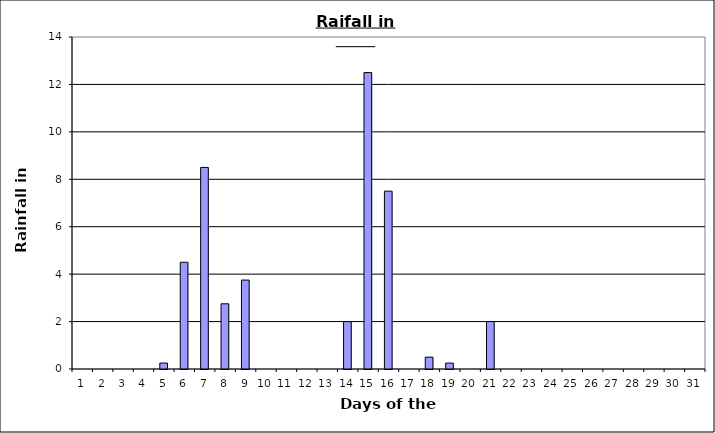
| Category | Series 0 |
|---|---|
| 0 | 0 |
| 1 | 0 |
| 2 | 0 |
| 3 | 0 |
| 4 | 0.25 |
| 5 | 4.5 |
| 6 | 8.5 |
| 7 | 2.75 |
| 8 | 3.75 |
| 9 | 0 |
| 10 | 0 |
| 11 | 0 |
| 12 | 0 |
| 13 | 2 |
| 14 | 12.5 |
| 15 | 7.5 |
| 16 | 0 |
| 17 | 0.5 |
| 18 | 0.25 |
| 19 | 0 |
| 20 | 2 |
| 21 | 0 |
| 22 | 0 |
| 23 | 0 |
| 24 | 0 |
| 25 | 0 |
| 26 | 0 |
| 27 | 0 |
| 28 | 0 |
| 29 | 0 |
| 30 | 0 |